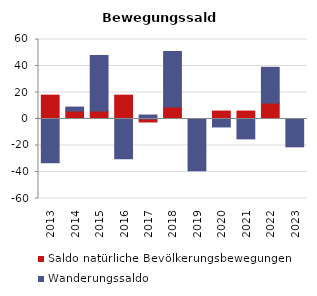
| Category | Saldo natürliche Bevölkerungsbewegungen | Wanderungssaldo |
|---|---|---|
| 2013.0 | 18 | -33 |
| 2014.0 | 6 | 3 |
| 2015.0 | 6 | 42 |
| 2016.0 | 18 | -30 |
| 2017.0 | -3 | 3 |
| 2018.0 | 9 | 42 |
| 2019.0 | 0 | -39 |
| 2020.0 | 6 | -6 |
| 2021.0 | 6 | -15 |
| 2022.0 | 12 | 27 |
| 2023.0 | 0 | -21 |